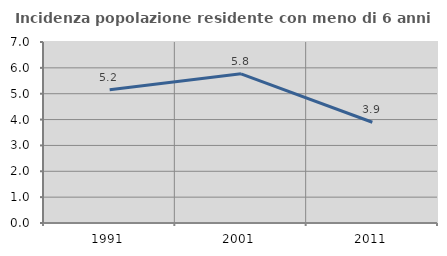
| Category | Incidenza popolazione residente con meno di 6 anni |
|---|---|
| 1991.0 | 5.15 |
| 2001.0 | 5.769 |
| 2011.0 | 3.897 |